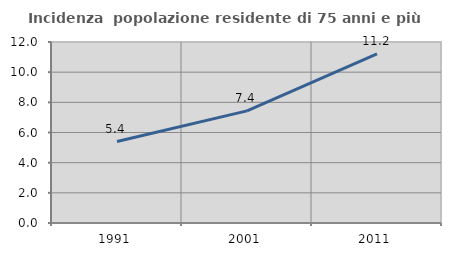
| Category | Incidenza  popolazione residente di 75 anni e più |
|---|---|
| 1991.0 | 5.402 |
| 2001.0 | 7.432 |
| 2011.0 | 11.212 |